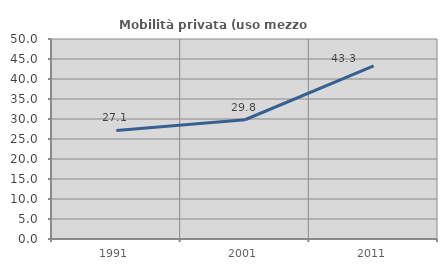
| Category | Mobilità privata (uso mezzo privato) |
|---|---|
| 1991.0 | 27.143 |
| 2001.0 | 29.811 |
| 2011.0 | 43.29 |